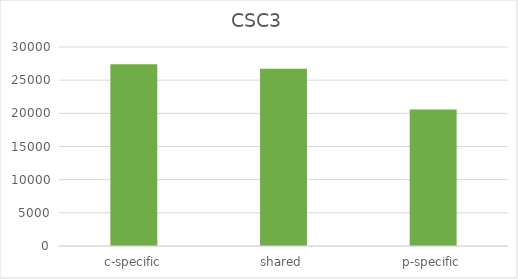
| Category | CSC3 |
|---|---|
| c-specific | 27386 |
| shared | 26728 |
| p-specific | 20569 |